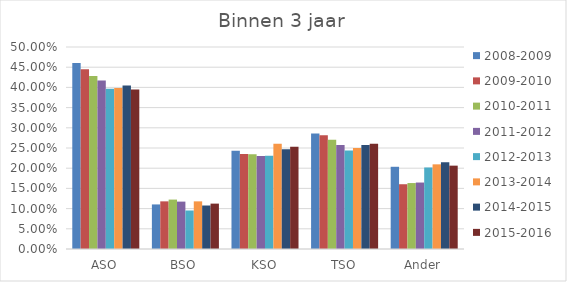
| Category | 2008-2009 | 2009-2010 | 2010-2011 | 2011-2012 | 2012-2013 | 2013-2014 | 2014-2015 | 2015-2016 |
|---|---|---|---|---|---|---|---|---|
| ASO | 0.46 | 0.445 | 0.428 | 0.417 | 0.397 | 0.398 | 0.405 | 0.395 |
| BSO | 0.11 | 0.118 | 0.122 | 0.117 | 0.095 | 0.118 | 0.108 | 0.112 |
| KSO | 0.243 | 0.235 | 0.235 | 0.23 | 0.231 | 0.26 | 0.247 | 0.253 |
| TSO | 0.286 | 0.281 | 0.27 | 0.257 | 0.244 | 0.25 | 0.258 | 0.261 |
| Ander | 0.204 | 0.16 | 0.163 | 0.165 | 0.202 | 0.21 | 0.215 | 0.206 |